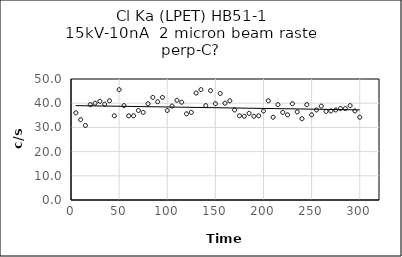
| Category | Series 0 |
|---|---|
| 5.0 | 36 |
| 10.0 | 33.2 |
| 15.0 | 30.8 |
| 20.0 | 39.4 |
| 25.0 | 40 |
| 30.0 | 40.8 |
| 35.0 | 39.6 |
| 40.0 | 41 |
| 45.0 | 34.8 |
| 50.0 | 45.6 |
| 55.0 | 39 |
| 60.0 | 34.8 |
| 65.0 | 34.8 |
| 70.0 | 37 |
| 75.0 | 36.2 |
| 80.0 | 39.8 |
| 85.0 | 42.4 |
| 90.0 | 40.6 |
| 95.0 | 42.4 |
| 100.0 | 37 |
| 105.0 | 38.8 |
| 110.0 | 41.2 |
| 115.0 | 40.4 |
| 120.0 | 35.6 |
| 125.0 | 36.2 |
| 130.0 | 44.2 |
| 135.0 | 45.6 |
| 140.0 | 39 |
| 145.0 | 45.2 |
| 150.0 | 39.8 |
| 155.0 | 44 |
| 160.0 | 40 |
| 165.0 | 41 |
| 170.0 | 37.2 |
| 175.0 | 34.8 |
| 180.0 | 34.6 |
| 185.0 | 35.8 |
| 190.0 | 34.6 |
| 195.0 | 34.8 |
| 200.0 | 36.8 |
| 205.0 | 41 |
| 210.0 | 34.2 |
| 215.0 | 39.4 |
| 220.0 | 36.2 |
| 225.0 | 35.2 |
| 230.0 | 39.8 |
| 235.0 | 36.4 |
| 240.0 | 33.6 |
| 245.0 | 39.4 |
| 250.0 | 35.2 |
| 255.0 | 37.2 |
| 260.0 | 38.8 |
| 265.0 | 36.6 |
| 270.0 | 36.8 |
| 275.0 | 37.2 |
| 280.0 | 37.8 |
| 285.0 | 37.8 |
| 290.0 | 39 |
| 295.0 | 36.8 |
| 300.0 | 34.2 |